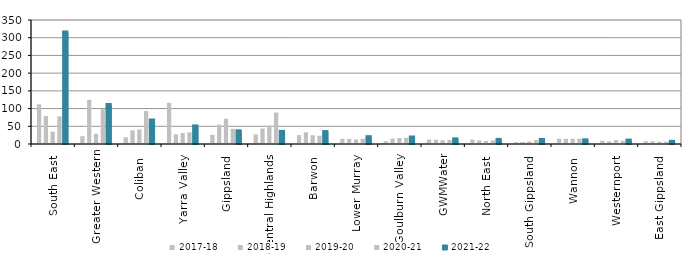
| Category | 2017-18 | 2018-19 | 2019-20 | 2020-21 | 2021-22 |
|---|---|---|---|---|---|
| South East  | 112.104 | 78.63 | 34.942 | 78.086 | 314.811 |
| Greater Western | 21.953 | 124.731 | 29.083 | 98.268 | 110.111 |
| Coliban  | 18.725 | 38.585 | 41.145 | 93.043 | 66.225 |
| Yarra Valley  | 116.13 | 27.28 | 30.904 | 32.871 | 49.546 |
| Gippsland  | 26.05 | 54.47 | 71.38 | 42.839 | 35.779 |
| Central Highlands  | 27.112 | 43.611 | 51.681 | 88.703 | 34.231 |
| Barwon  | 25.098 | 33.122 | 24.735 | 23.329 | 33.649 |
| Lower Murray  | 14.802 | 14.59 | 12.789 | 15.028 | 19.273 |
| Goulburn Valley  | 7.877 | 15.04 | 16.709 | 17.455 | 18.342 |
| GWMWater | 12.492 | 12.293 | 10.705 | 11.599 | 13.075 |
| North East  | 12.532 | 10.023 | 8.856 | 10.24 | 11.525 |
| South Gippsland  | 5.301 | 5.718 | 7.04 | 10.967 | 11.321 |
| Wannon  | 14.807 | 14.616 | 14.931 | 15.02 | 10.311 |
| Westernport  | 9.297 | 7.811 | 11.217 | 9.137 | 9.566 |
| East Gippsland  | 7.81 | 7.433 | 6.556 | 6.426 | 6.075 |